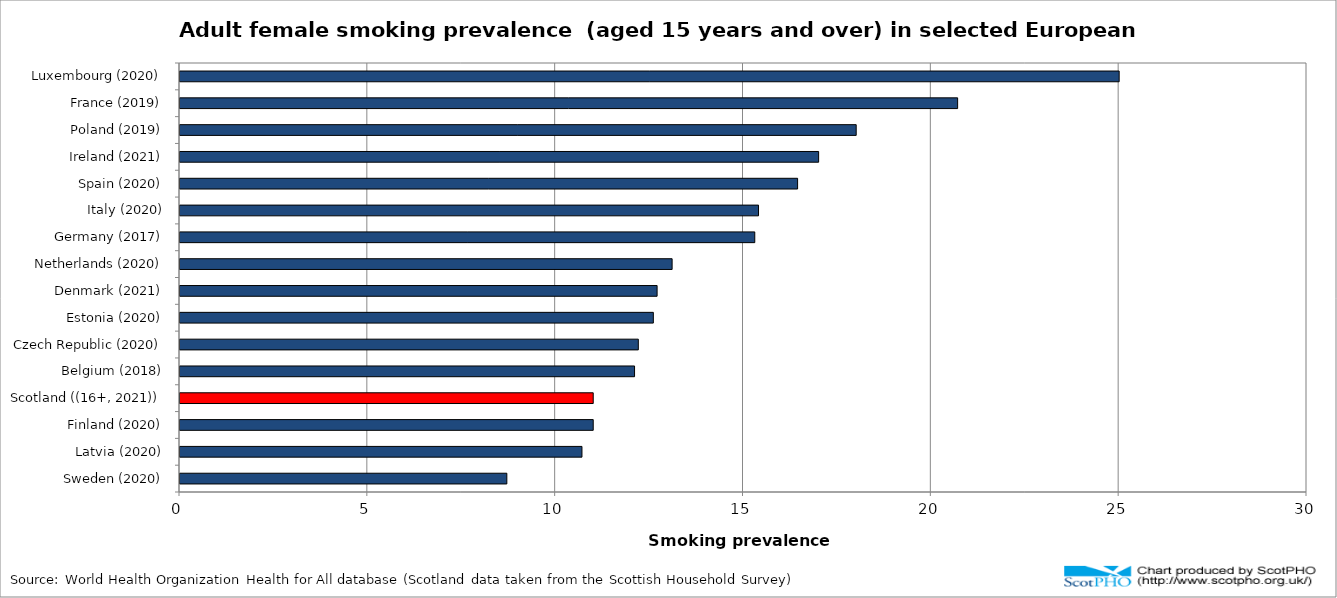
| Category | % |
|---|---|
| Sweden (2020) | 8.7 |
| Latvia (2020) | 10.7 |
| Finland (2020) | 11 |
| Scotland ((16+, 2021)) | 11 |
| Belgium (2018) | 12.1 |
| Czech Republic (2020) | 12.2 |
| Estonia (2020) | 12.6 |
| Denmark (2021) | 12.7 |
| Netherlands (2020) | 13.1 |
| Germany (2017) | 15.3 |
| Italy (2020) | 15.4 |
| Spain (2020) | 16.44 |
| Ireland (2021) | 17 |
| Poland (2019) | 18 |
| France (2019) | 20.7 |
| Luxembourg (2020) | 25 |